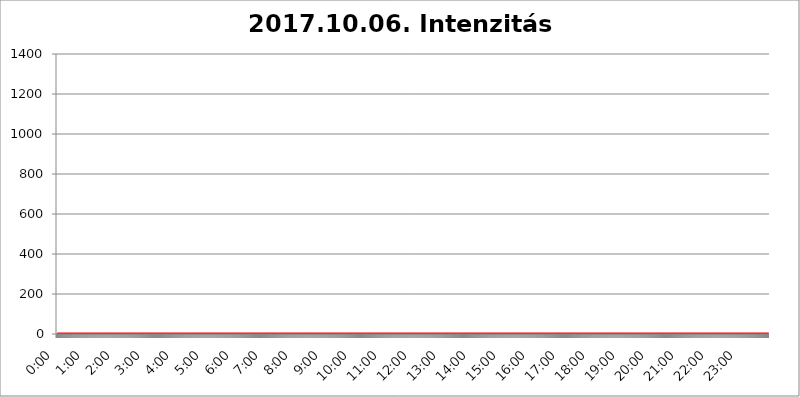
| Category | 2017.10.06. Intenzitás [W/m^2] |
|---|---|
| 0.0 | 0 |
| 0.0006944444444444445 | 0 |
| 0.001388888888888889 | 0 |
| 0.0020833333333333333 | 0 |
| 0.002777777777777778 | 0 |
| 0.003472222222222222 | 0 |
| 0.004166666666666667 | 0 |
| 0.004861111111111111 | 0 |
| 0.005555555555555556 | 0 |
| 0.0062499999999999995 | 0 |
| 0.006944444444444444 | 0 |
| 0.007638888888888889 | 0 |
| 0.008333333333333333 | 0 |
| 0.009027777777777779 | 0 |
| 0.009722222222222222 | 0 |
| 0.010416666666666666 | 0 |
| 0.011111111111111112 | 0 |
| 0.011805555555555555 | 0 |
| 0.012499999999999999 | 0 |
| 0.013194444444444444 | 0 |
| 0.013888888888888888 | 0 |
| 0.014583333333333332 | 0 |
| 0.015277777777777777 | 0 |
| 0.015972222222222224 | 0 |
| 0.016666666666666666 | 0 |
| 0.017361111111111112 | 0 |
| 0.018055555555555557 | 0 |
| 0.01875 | 0 |
| 0.019444444444444445 | 0 |
| 0.02013888888888889 | 0 |
| 0.020833333333333332 | 0 |
| 0.02152777777777778 | 0 |
| 0.022222222222222223 | 0 |
| 0.02291666666666667 | 0 |
| 0.02361111111111111 | 0 |
| 0.024305555555555556 | 0 |
| 0.024999999999999998 | 0 |
| 0.025694444444444447 | 0 |
| 0.02638888888888889 | 0 |
| 0.027083333333333334 | 0 |
| 0.027777777777777776 | 0 |
| 0.02847222222222222 | 0 |
| 0.029166666666666664 | 0 |
| 0.029861111111111113 | 0 |
| 0.030555555555555555 | 0 |
| 0.03125 | 0 |
| 0.03194444444444445 | 0 |
| 0.03263888888888889 | 0 |
| 0.03333333333333333 | 0 |
| 0.034027777777777775 | 0 |
| 0.034722222222222224 | 0 |
| 0.035416666666666666 | 0 |
| 0.036111111111111115 | 0 |
| 0.03680555555555556 | 0 |
| 0.0375 | 0 |
| 0.03819444444444444 | 0 |
| 0.03888888888888889 | 0 |
| 0.03958333333333333 | 0 |
| 0.04027777777777778 | 0 |
| 0.04097222222222222 | 0 |
| 0.041666666666666664 | 0 |
| 0.042361111111111106 | 0 |
| 0.04305555555555556 | 0 |
| 0.043750000000000004 | 0 |
| 0.044444444444444446 | 0 |
| 0.04513888888888889 | 0 |
| 0.04583333333333334 | 0 |
| 0.04652777777777778 | 0 |
| 0.04722222222222222 | 0 |
| 0.04791666666666666 | 0 |
| 0.04861111111111111 | 0 |
| 0.049305555555555554 | 0 |
| 0.049999999999999996 | 0 |
| 0.05069444444444445 | 0 |
| 0.051388888888888894 | 0 |
| 0.052083333333333336 | 0 |
| 0.05277777777777778 | 0 |
| 0.05347222222222222 | 0 |
| 0.05416666666666667 | 0 |
| 0.05486111111111111 | 0 |
| 0.05555555555555555 | 0 |
| 0.05625 | 0 |
| 0.05694444444444444 | 0 |
| 0.057638888888888885 | 0 |
| 0.05833333333333333 | 0 |
| 0.05902777777777778 | 0 |
| 0.059722222222222225 | 0 |
| 0.06041666666666667 | 0 |
| 0.061111111111111116 | 0 |
| 0.06180555555555556 | 0 |
| 0.0625 | 0 |
| 0.06319444444444444 | 0 |
| 0.06388888888888888 | 0 |
| 0.06458333333333334 | 0 |
| 0.06527777777777778 | 0 |
| 0.06597222222222222 | 0 |
| 0.06666666666666667 | 0 |
| 0.06736111111111111 | 0 |
| 0.06805555555555555 | 0 |
| 0.06874999999999999 | 0 |
| 0.06944444444444443 | 0 |
| 0.07013888888888889 | 0 |
| 0.07083333333333333 | 0 |
| 0.07152777777777779 | 0 |
| 0.07222222222222223 | 0 |
| 0.07291666666666667 | 0 |
| 0.07361111111111111 | 0 |
| 0.07430555555555556 | 0 |
| 0.075 | 0 |
| 0.07569444444444444 | 0 |
| 0.0763888888888889 | 0 |
| 0.07708333333333334 | 0 |
| 0.07777777777777778 | 0 |
| 0.07847222222222222 | 0 |
| 0.07916666666666666 | 0 |
| 0.0798611111111111 | 0 |
| 0.08055555555555556 | 0 |
| 0.08125 | 0 |
| 0.08194444444444444 | 0 |
| 0.08263888888888889 | 0 |
| 0.08333333333333333 | 0 |
| 0.08402777777777777 | 0 |
| 0.08472222222222221 | 0 |
| 0.08541666666666665 | 0 |
| 0.08611111111111112 | 0 |
| 0.08680555555555557 | 0 |
| 0.08750000000000001 | 0 |
| 0.08819444444444445 | 0 |
| 0.08888888888888889 | 0 |
| 0.08958333333333333 | 0 |
| 0.09027777777777778 | 0 |
| 0.09097222222222222 | 0 |
| 0.09166666666666667 | 0 |
| 0.09236111111111112 | 0 |
| 0.09305555555555556 | 0 |
| 0.09375 | 0 |
| 0.09444444444444444 | 0 |
| 0.09513888888888888 | 0 |
| 0.09583333333333333 | 0 |
| 0.09652777777777777 | 0 |
| 0.09722222222222222 | 0 |
| 0.09791666666666667 | 0 |
| 0.09861111111111111 | 0 |
| 0.09930555555555555 | 0 |
| 0.09999999999999999 | 0 |
| 0.10069444444444443 | 0 |
| 0.1013888888888889 | 0 |
| 0.10208333333333335 | 0 |
| 0.10277777777777779 | 0 |
| 0.10347222222222223 | 0 |
| 0.10416666666666667 | 0 |
| 0.10486111111111111 | 0 |
| 0.10555555555555556 | 0 |
| 0.10625 | 0 |
| 0.10694444444444444 | 0 |
| 0.1076388888888889 | 0 |
| 0.10833333333333334 | 0 |
| 0.10902777777777778 | 0 |
| 0.10972222222222222 | 0 |
| 0.1111111111111111 | 0 |
| 0.11180555555555556 | 0 |
| 0.11180555555555556 | 0 |
| 0.1125 | 0 |
| 0.11319444444444444 | 0 |
| 0.11388888888888889 | 0 |
| 0.11458333333333333 | 0 |
| 0.11527777777777777 | 0 |
| 0.11597222222222221 | 0 |
| 0.11666666666666665 | 0 |
| 0.1173611111111111 | 0 |
| 0.11805555555555557 | 0 |
| 0.11944444444444445 | 0 |
| 0.12013888888888889 | 0 |
| 0.12083333333333333 | 0 |
| 0.12152777777777778 | 0 |
| 0.12222222222222223 | 0 |
| 0.12291666666666667 | 0 |
| 0.12291666666666667 | 0 |
| 0.12361111111111112 | 0 |
| 0.12430555555555556 | 0 |
| 0.125 | 0 |
| 0.12569444444444444 | 0 |
| 0.12638888888888888 | 0 |
| 0.12708333333333333 | 0 |
| 0.16875 | 0 |
| 0.12847222222222224 | 0 |
| 0.12916666666666668 | 0 |
| 0.12986111111111112 | 0 |
| 0.13055555555555556 | 0 |
| 0.13125 | 0 |
| 0.13194444444444445 | 0 |
| 0.1326388888888889 | 0 |
| 0.13333333333333333 | 0 |
| 0.13402777777777777 | 0 |
| 0.13402777777777777 | 0 |
| 0.13472222222222222 | 0 |
| 0.13541666666666666 | 0 |
| 0.1361111111111111 | 0 |
| 0.13749999999999998 | 0 |
| 0.13819444444444443 | 0 |
| 0.1388888888888889 | 0 |
| 0.13958333333333334 | 0 |
| 0.14027777777777778 | 0 |
| 0.14097222222222222 | 0 |
| 0.14166666666666666 | 0 |
| 0.1423611111111111 | 0 |
| 0.14305555555555557 | 0 |
| 0.14375000000000002 | 0 |
| 0.14444444444444446 | 0 |
| 0.1451388888888889 | 0 |
| 0.1451388888888889 | 0 |
| 0.14652777777777778 | 0 |
| 0.14722222222222223 | 0 |
| 0.14791666666666667 | 0 |
| 0.1486111111111111 | 0 |
| 0.14930555555555555 | 0 |
| 0.15 | 0 |
| 0.15069444444444444 | 0 |
| 0.15138888888888888 | 0 |
| 0.15208333333333332 | 0 |
| 0.15277777777777776 | 0 |
| 0.15347222222222223 | 0 |
| 0.15416666666666667 | 0 |
| 0.15486111111111112 | 0 |
| 0.15555555555555556 | 0 |
| 0.15625 | 0 |
| 0.15694444444444444 | 0 |
| 0.15763888888888888 | 0 |
| 0.15833333333333333 | 0 |
| 0.15902777777777777 | 0 |
| 0.15972222222222224 | 0 |
| 0.16041666666666668 | 0 |
| 0.16111111111111112 | 0 |
| 0.16180555555555556 | 0 |
| 0.1625 | 0 |
| 0.16319444444444445 | 0 |
| 0.1638888888888889 | 0 |
| 0.16458333333333333 | 0 |
| 0.16527777777777777 | 0 |
| 0.16597222222222222 | 0 |
| 0.16666666666666666 | 0 |
| 0.1673611111111111 | 0 |
| 0.16805555555555554 | 0 |
| 0.16874999999999998 | 0 |
| 0.16944444444444443 | 0 |
| 0.17013888888888887 | 0 |
| 0.1708333333333333 | 0 |
| 0.17152777777777775 | 0 |
| 0.17222222222222225 | 0 |
| 0.1729166666666667 | 0 |
| 0.17361111111111113 | 0 |
| 0.17430555555555557 | 0 |
| 0.17500000000000002 | 0 |
| 0.17569444444444446 | 0 |
| 0.1763888888888889 | 0 |
| 0.17708333333333334 | 0 |
| 0.17777777777777778 | 0 |
| 0.17847222222222223 | 0 |
| 0.17916666666666667 | 0 |
| 0.1798611111111111 | 0 |
| 0.18055555555555555 | 0 |
| 0.18125 | 0 |
| 0.18194444444444444 | 0 |
| 0.1826388888888889 | 0 |
| 0.18333333333333335 | 0 |
| 0.1840277777777778 | 0 |
| 0.18472222222222223 | 0 |
| 0.18541666666666667 | 0 |
| 0.18611111111111112 | 0 |
| 0.18680555555555556 | 0 |
| 0.1875 | 0 |
| 0.18819444444444444 | 0 |
| 0.18888888888888888 | 0 |
| 0.18958333333333333 | 0 |
| 0.19027777777777777 | 0 |
| 0.1909722222222222 | 0 |
| 0.19166666666666665 | 0 |
| 0.19236111111111112 | 0 |
| 0.19305555555555554 | 0 |
| 0.19375 | 0 |
| 0.19444444444444445 | 0 |
| 0.1951388888888889 | 0 |
| 0.19583333333333333 | 0 |
| 0.19652777777777777 | 0 |
| 0.19722222222222222 | 0 |
| 0.19791666666666666 | 0 |
| 0.1986111111111111 | 0 |
| 0.19930555555555554 | 0 |
| 0.19999999999999998 | 0 |
| 0.20069444444444443 | 0 |
| 0.20138888888888887 | 0 |
| 0.2020833333333333 | 0 |
| 0.2027777777777778 | 0 |
| 0.2034722222222222 | 0 |
| 0.2041666666666667 | 0 |
| 0.20486111111111113 | 0 |
| 0.20555555555555557 | 0 |
| 0.20625000000000002 | 0 |
| 0.20694444444444446 | 0 |
| 0.2076388888888889 | 0 |
| 0.20833333333333334 | 0 |
| 0.20902777777777778 | 0 |
| 0.20972222222222223 | 0 |
| 0.21041666666666667 | 0 |
| 0.2111111111111111 | 0 |
| 0.21180555555555555 | 0 |
| 0.2125 | 0 |
| 0.21319444444444444 | 0 |
| 0.2138888888888889 | 0 |
| 0.21458333333333335 | 0 |
| 0.2152777777777778 | 0 |
| 0.21597222222222223 | 0 |
| 0.21666666666666667 | 0 |
| 0.21736111111111112 | 0 |
| 0.21805555555555556 | 0 |
| 0.21875 | 0 |
| 0.21944444444444444 | 0 |
| 0.22013888888888888 | 0 |
| 0.22083333333333333 | 0 |
| 0.22152777777777777 | 0 |
| 0.2222222222222222 | 0 |
| 0.22291666666666665 | 0 |
| 0.2236111111111111 | 0 |
| 0.22430555555555556 | 0 |
| 0.225 | 0 |
| 0.22569444444444445 | 0 |
| 0.2263888888888889 | 0 |
| 0.22708333333333333 | 0 |
| 0.22777777777777777 | 0 |
| 0.22847222222222222 | 0 |
| 0.22916666666666666 | 0 |
| 0.2298611111111111 | 0 |
| 0.23055555555555554 | 0 |
| 0.23124999999999998 | 0 |
| 0.23194444444444443 | 0 |
| 0.23263888888888887 | 0 |
| 0.2333333333333333 | 0 |
| 0.2340277777777778 | 0 |
| 0.2347222222222222 | 0 |
| 0.2354166666666667 | 0 |
| 0.23611111111111113 | 0 |
| 0.23680555555555557 | 0 |
| 0.23750000000000002 | 0 |
| 0.23819444444444446 | 0 |
| 0.2388888888888889 | 0 |
| 0.23958333333333334 | 0 |
| 0.24027777777777778 | 0 |
| 0.24097222222222223 | 0 |
| 0.24166666666666667 | 0 |
| 0.2423611111111111 | 0 |
| 0.24305555555555555 | 0 |
| 0.24375 | 0 |
| 0.24444444444444446 | 0 |
| 0.24513888888888888 | 0 |
| 0.24583333333333335 | 0 |
| 0.2465277777777778 | 0 |
| 0.24722222222222223 | 0 |
| 0.24791666666666667 | 0 |
| 0.24861111111111112 | 0 |
| 0.24930555555555556 | 0 |
| 0.25 | 0 |
| 0.25069444444444444 | 0 |
| 0.2513888888888889 | 0 |
| 0.2520833333333333 | 0 |
| 0.25277777777777777 | 0 |
| 0.2534722222222222 | 0 |
| 0.25416666666666665 | 0 |
| 0.2548611111111111 | 0 |
| 0.2555555555555556 | 0 |
| 0.25625000000000003 | 0 |
| 0.2569444444444445 | 0 |
| 0.2576388888888889 | 0 |
| 0.25833333333333336 | 0 |
| 0.2590277777777778 | 0 |
| 0.25972222222222224 | 0 |
| 0.2604166666666667 | 0 |
| 0.2611111111111111 | 0 |
| 0.26180555555555557 | 0 |
| 0.2625 | 0 |
| 0.26319444444444445 | 0 |
| 0.2638888888888889 | 0 |
| 0.26458333333333334 | 0 |
| 0.2652777777777778 | 0 |
| 0.2659722222222222 | 0 |
| 0.26666666666666666 | 0 |
| 0.2673611111111111 | 0 |
| 0.26805555555555555 | 0 |
| 0.26875 | 0 |
| 0.26944444444444443 | 0 |
| 0.2701388888888889 | 0 |
| 0.2708333333333333 | 0 |
| 0.27152777777777776 | 0 |
| 0.2722222222222222 | 0 |
| 0.27291666666666664 | 0 |
| 0.2736111111111111 | 0 |
| 0.2743055555555555 | 0 |
| 0.27499999999999997 | 0 |
| 0.27569444444444446 | 0 |
| 0.27638888888888885 | 0 |
| 0.27708333333333335 | 0 |
| 0.2777777777777778 | 0 |
| 0.27847222222222223 | 0 |
| 0.2791666666666667 | 0 |
| 0.2798611111111111 | 0 |
| 0.28055555555555556 | 0 |
| 0.28125 | 0 |
| 0.28194444444444444 | 0 |
| 0.2826388888888889 | 0 |
| 0.2833333333333333 | 0 |
| 0.28402777777777777 | 0 |
| 0.2847222222222222 | 0 |
| 0.28541666666666665 | 0 |
| 0.28611111111111115 | 0 |
| 0.28680555555555554 | 0 |
| 0.28750000000000003 | 0 |
| 0.2881944444444445 | 0 |
| 0.2888888888888889 | 0 |
| 0.28958333333333336 | 0 |
| 0.2902777777777778 | 0 |
| 0.29097222222222224 | 0 |
| 0.2916666666666667 | 0 |
| 0.2923611111111111 | 0 |
| 0.29305555555555557 | 0 |
| 0.29375 | 0 |
| 0.29444444444444445 | 0 |
| 0.2951388888888889 | 0 |
| 0.29583333333333334 | 0 |
| 0.2965277777777778 | 0 |
| 0.2972222222222222 | 0 |
| 0.29791666666666666 | 0 |
| 0.2986111111111111 | 0 |
| 0.29930555555555555 | 0 |
| 0.3 | 0 |
| 0.30069444444444443 | 0 |
| 0.3013888888888889 | 0 |
| 0.3020833333333333 | 0 |
| 0.30277777777777776 | 0 |
| 0.3034722222222222 | 0 |
| 0.30416666666666664 | 0 |
| 0.3048611111111111 | 0 |
| 0.3055555555555555 | 0 |
| 0.30624999999999997 | 0 |
| 0.3069444444444444 | 0 |
| 0.3076388888888889 | 0 |
| 0.30833333333333335 | 0 |
| 0.3090277777777778 | 0 |
| 0.30972222222222223 | 0 |
| 0.3104166666666667 | 0 |
| 0.3111111111111111 | 0 |
| 0.31180555555555556 | 0 |
| 0.3125 | 0 |
| 0.31319444444444444 | 0 |
| 0.3138888888888889 | 0 |
| 0.3145833333333333 | 0 |
| 0.31527777777777777 | 0 |
| 0.3159722222222222 | 0 |
| 0.31666666666666665 | 0 |
| 0.31736111111111115 | 0 |
| 0.31805555555555554 | 0 |
| 0.31875000000000003 | 0 |
| 0.3194444444444445 | 0 |
| 0.3201388888888889 | 0 |
| 0.32083333333333336 | 0 |
| 0.3215277777777778 | 0 |
| 0.32222222222222224 | 0 |
| 0.3229166666666667 | 0 |
| 0.3236111111111111 | 0 |
| 0.32430555555555557 | 0 |
| 0.325 | 0 |
| 0.32569444444444445 | 0 |
| 0.3263888888888889 | 0 |
| 0.32708333333333334 | 0 |
| 0.3277777777777778 | 0 |
| 0.3284722222222222 | 0 |
| 0.32916666666666666 | 0 |
| 0.3298611111111111 | 0 |
| 0.33055555555555555 | 0 |
| 0.33125 | 0 |
| 0.33194444444444443 | 0 |
| 0.3326388888888889 | 0 |
| 0.3333333333333333 | 0 |
| 0.3340277777777778 | 0 |
| 0.3347222222222222 | 0 |
| 0.3354166666666667 | 0 |
| 0.3361111111111111 | 0 |
| 0.3368055555555556 | 0 |
| 0.33749999999999997 | 0 |
| 0.33819444444444446 | 0 |
| 0.33888888888888885 | 0 |
| 0.33958333333333335 | 0 |
| 0.34027777777777773 | 0 |
| 0.34097222222222223 | 0 |
| 0.3416666666666666 | 0 |
| 0.3423611111111111 | 0 |
| 0.3430555555555555 | 0 |
| 0.34375 | 0 |
| 0.3444444444444445 | 0 |
| 0.3451388888888889 | 0 |
| 0.3458333333333334 | 0 |
| 0.34652777777777777 | 0 |
| 0.34722222222222227 | 0 |
| 0.34791666666666665 | 0 |
| 0.34861111111111115 | 0 |
| 0.34930555555555554 | 0 |
| 0.35000000000000003 | 0 |
| 0.3506944444444444 | 0 |
| 0.3513888888888889 | 0 |
| 0.3520833333333333 | 0 |
| 0.3527777777777778 | 0 |
| 0.3534722222222222 | 0 |
| 0.3541666666666667 | 0 |
| 0.3548611111111111 | 0 |
| 0.35555555555555557 | 0 |
| 0.35625 | 0 |
| 0.35694444444444445 | 0 |
| 0.3576388888888889 | 0 |
| 0.35833333333333334 | 0 |
| 0.3590277777777778 | 0 |
| 0.3597222222222222 | 0 |
| 0.36041666666666666 | 0 |
| 0.3611111111111111 | 0 |
| 0.36180555555555555 | 0 |
| 0.3625 | 0 |
| 0.36319444444444443 | 0 |
| 0.3638888888888889 | 0 |
| 0.3645833333333333 | 0 |
| 0.3652777777777778 | 0 |
| 0.3659722222222222 | 0 |
| 0.3666666666666667 | 0 |
| 0.3673611111111111 | 0 |
| 0.3680555555555556 | 0 |
| 0.36874999999999997 | 0 |
| 0.36944444444444446 | 0 |
| 0.37013888888888885 | 0 |
| 0.37083333333333335 | 0 |
| 0.37152777777777773 | 0 |
| 0.37222222222222223 | 0 |
| 0.3729166666666666 | 0 |
| 0.3736111111111111 | 0 |
| 0.3743055555555555 | 0 |
| 0.375 | 0 |
| 0.3756944444444445 | 0 |
| 0.3763888888888889 | 0 |
| 0.3770833333333334 | 0 |
| 0.37777777777777777 | 0 |
| 0.37847222222222227 | 0 |
| 0.37916666666666665 | 0 |
| 0.37986111111111115 | 0 |
| 0.38055555555555554 | 0 |
| 0.38125000000000003 | 0 |
| 0.3819444444444444 | 0 |
| 0.3826388888888889 | 0 |
| 0.3833333333333333 | 0 |
| 0.3840277777777778 | 0 |
| 0.3847222222222222 | 0 |
| 0.3854166666666667 | 0 |
| 0.3861111111111111 | 0 |
| 0.38680555555555557 | 0 |
| 0.3875 | 0 |
| 0.38819444444444445 | 0 |
| 0.3888888888888889 | 0 |
| 0.38958333333333334 | 0 |
| 0.3902777777777778 | 0 |
| 0.3909722222222222 | 0 |
| 0.39166666666666666 | 0 |
| 0.3923611111111111 | 0 |
| 0.39305555555555555 | 0 |
| 0.39375 | 0 |
| 0.39444444444444443 | 0 |
| 0.3951388888888889 | 0 |
| 0.3958333333333333 | 0 |
| 0.3965277777777778 | 0 |
| 0.3972222222222222 | 0 |
| 0.3979166666666667 | 0 |
| 0.3986111111111111 | 0 |
| 0.3993055555555556 | 0 |
| 0.39999999999999997 | 0 |
| 0.40069444444444446 | 0 |
| 0.40138888888888885 | 0 |
| 0.40208333333333335 | 0 |
| 0.40277777777777773 | 0 |
| 0.40347222222222223 | 0 |
| 0.4041666666666666 | 0 |
| 0.4048611111111111 | 0 |
| 0.4055555555555555 | 0 |
| 0.40625 | 0 |
| 0.4069444444444445 | 0 |
| 0.4076388888888889 | 0 |
| 0.4083333333333334 | 0 |
| 0.40902777777777777 | 0 |
| 0.40972222222222227 | 0 |
| 0.41041666666666665 | 0 |
| 0.41111111111111115 | 0 |
| 0.41180555555555554 | 0 |
| 0.41250000000000003 | 0 |
| 0.4131944444444444 | 0 |
| 0.4138888888888889 | 0 |
| 0.4145833333333333 | 0 |
| 0.4152777777777778 | 0 |
| 0.4159722222222222 | 0 |
| 0.4166666666666667 | 0 |
| 0.4173611111111111 | 0 |
| 0.41805555555555557 | 0 |
| 0.41875 | 0 |
| 0.41944444444444445 | 0 |
| 0.4201388888888889 | 0 |
| 0.42083333333333334 | 0 |
| 0.4215277777777778 | 0 |
| 0.4222222222222222 | 0 |
| 0.42291666666666666 | 0 |
| 0.4236111111111111 | 0 |
| 0.42430555555555555 | 0 |
| 0.425 | 0 |
| 0.42569444444444443 | 0 |
| 0.4263888888888889 | 0 |
| 0.4270833333333333 | 0 |
| 0.4277777777777778 | 0 |
| 0.4284722222222222 | 0 |
| 0.4291666666666667 | 0 |
| 0.4298611111111111 | 0 |
| 0.4305555555555556 | 0 |
| 0.43124999999999997 | 0 |
| 0.43194444444444446 | 0 |
| 0.43263888888888885 | 0 |
| 0.43333333333333335 | 0 |
| 0.43402777777777773 | 0 |
| 0.43472222222222223 | 0 |
| 0.4354166666666666 | 0 |
| 0.4361111111111111 | 0 |
| 0.4368055555555555 | 0 |
| 0.4375 | 0 |
| 0.4381944444444445 | 0 |
| 0.4388888888888889 | 0 |
| 0.4395833333333334 | 0 |
| 0.44027777777777777 | 0 |
| 0.44097222222222227 | 0 |
| 0.44166666666666665 | 0 |
| 0.44236111111111115 | 0 |
| 0.44305555555555554 | 0 |
| 0.44375000000000003 | 0 |
| 0.4444444444444444 | 0 |
| 0.4451388888888889 | 0 |
| 0.4458333333333333 | 0 |
| 0.4465277777777778 | 0 |
| 0.4472222222222222 | 0 |
| 0.4479166666666667 | 0 |
| 0.4486111111111111 | 0 |
| 0.44930555555555557 | 0 |
| 0.45 | 0 |
| 0.45069444444444445 | 0 |
| 0.4513888888888889 | 0 |
| 0.45208333333333334 | 0 |
| 0.4527777777777778 | 0 |
| 0.4534722222222222 | 0 |
| 0.45416666666666666 | 0 |
| 0.4548611111111111 | 0 |
| 0.45555555555555555 | 0 |
| 0.45625 | 0 |
| 0.45694444444444443 | 0 |
| 0.4576388888888889 | 0 |
| 0.4583333333333333 | 0 |
| 0.4590277777777778 | 0 |
| 0.4597222222222222 | 0 |
| 0.4604166666666667 | 0 |
| 0.4611111111111111 | 0 |
| 0.4618055555555556 | 0 |
| 0.46249999999999997 | 0 |
| 0.46319444444444446 | 0 |
| 0.46388888888888885 | 0 |
| 0.46458333333333335 | 0 |
| 0.46527777777777773 | 0 |
| 0.46597222222222223 | 0 |
| 0.4666666666666666 | 0 |
| 0.4673611111111111 | 0 |
| 0.4680555555555555 | 0 |
| 0.46875 | 0 |
| 0.4694444444444445 | 0 |
| 0.4701388888888889 | 0 |
| 0.4708333333333334 | 0 |
| 0.47152777777777777 | 0 |
| 0.47222222222222227 | 0 |
| 0.47291666666666665 | 0 |
| 0.47361111111111115 | 0 |
| 0.47430555555555554 | 0 |
| 0.47500000000000003 | 0 |
| 0.4756944444444444 | 0 |
| 0.4763888888888889 | 0 |
| 0.4770833333333333 | 0 |
| 0.4777777777777778 | 0 |
| 0.4784722222222222 | 0 |
| 0.4791666666666667 | 0 |
| 0.4798611111111111 | 0 |
| 0.48055555555555557 | 0 |
| 0.48125 | 0 |
| 0.48194444444444445 | 0 |
| 0.4826388888888889 | 0 |
| 0.48333333333333334 | 0 |
| 0.4840277777777778 | 0 |
| 0.4847222222222222 | 0 |
| 0.48541666666666666 | 0 |
| 0.4861111111111111 | 0 |
| 0.48680555555555555 | 0 |
| 0.4875 | 0 |
| 0.48819444444444443 | 0 |
| 0.4888888888888889 | 0 |
| 0.4895833333333333 | 0 |
| 0.4902777777777778 | 0 |
| 0.4909722222222222 | 0 |
| 0.4916666666666667 | 0 |
| 0.4923611111111111 | 0 |
| 0.4930555555555556 | 0 |
| 0.49374999999999997 | 0 |
| 0.49444444444444446 | 0 |
| 0.49513888888888885 | 0 |
| 0.49583333333333335 | 0 |
| 0.49652777777777773 | 0 |
| 0.49722222222222223 | 0 |
| 0.4979166666666666 | 0 |
| 0.4986111111111111 | 0 |
| 0.4993055555555555 | 0 |
| 0.5 | 0 |
| 0.5006944444444444 | 0 |
| 0.5013888888888889 | 0 |
| 0.5020833333333333 | 0 |
| 0.5027777777777778 | 0 |
| 0.5034722222222222 | 0 |
| 0.5041666666666667 | 0 |
| 0.5048611111111111 | 0 |
| 0.5055555555555555 | 0 |
| 0.50625 | 0 |
| 0.5069444444444444 | 0 |
| 0.5076388888888889 | 0 |
| 0.5083333333333333 | 0 |
| 0.5090277777777777 | 0 |
| 0.5097222222222222 | 0 |
| 0.5104166666666666 | 0 |
| 0.5111111111111112 | 0 |
| 0.5118055555555555 | 0 |
| 0.5125000000000001 | 0 |
| 0.5131944444444444 | 0 |
| 0.513888888888889 | 0 |
| 0.5145833333333333 | 0 |
| 0.5152777777777778 | 0 |
| 0.5159722222222222 | 0 |
| 0.5166666666666667 | 0 |
| 0.517361111111111 | 0 |
| 0.5180555555555556 | 0 |
| 0.5187499999999999 | 0 |
| 0.5194444444444445 | 0 |
| 0.5201388888888888 | 0 |
| 0.5208333333333334 | 0 |
| 0.5215277777777778 | 0 |
| 0.5222222222222223 | 0 |
| 0.5229166666666667 | 0 |
| 0.5236111111111111 | 0 |
| 0.5243055555555556 | 0 |
| 0.525 | 0 |
| 0.5256944444444445 | 0 |
| 0.5263888888888889 | 0 |
| 0.5270833333333333 | 0 |
| 0.5277777777777778 | 0 |
| 0.5284722222222222 | 0 |
| 0.5291666666666667 | 0 |
| 0.5298611111111111 | 0 |
| 0.5305555555555556 | 0 |
| 0.53125 | 0 |
| 0.5319444444444444 | 0 |
| 0.5326388888888889 | 0 |
| 0.5333333333333333 | 0 |
| 0.5340277777777778 | 0 |
| 0.5347222222222222 | 0 |
| 0.5354166666666667 | 0 |
| 0.5361111111111111 | 0 |
| 0.5368055555555555 | 0 |
| 0.5375 | 0 |
| 0.5381944444444444 | 0 |
| 0.5388888888888889 | 0 |
| 0.5395833333333333 | 0 |
| 0.5402777777777777 | 0 |
| 0.5409722222222222 | 0 |
| 0.5416666666666666 | 0 |
| 0.5423611111111112 | 0 |
| 0.5430555555555555 | 0 |
| 0.5437500000000001 | 0 |
| 0.5444444444444444 | 0 |
| 0.545138888888889 | 0 |
| 0.5458333333333333 | 0 |
| 0.5465277777777778 | 0 |
| 0.5472222222222222 | 0 |
| 0.5479166666666667 | 0 |
| 0.548611111111111 | 0 |
| 0.5493055555555556 | 0 |
| 0.5499999999999999 | 0 |
| 0.5506944444444445 | 0 |
| 0.5513888888888888 | 0 |
| 0.5520833333333334 | 0 |
| 0.5527777777777778 | 0 |
| 0.5534722222222223 | 0 |
| 0.5541666666666667 | 0 |
| 0.5548611111111111 | 0 |
| 0.5555555555555556 | 0 |
| 0.55625 | 0 |
| 0.5569444444444445 | 0 |
| 0.5576388888888889 | 0 |
| 0.5583333333333333 | 0 |
| 0.5590277777777778 | 0 |
| 0.5597222222222222 | 0 |
| 0.5604166666666667 | 0 |
| 0.5611111111111111 | 0 |
| 0.5618055555555556 | 0 |
| 0.5625 | 0 |
| 0.5631944444444444 | 0 |
| 0.5638888888888889 | 0 |
| 0.5645833333333333 | 0 |
| 0.5652777777777778 | 0 |
| 0.5659722222222222 | 0 |
| 0.5666666666666667 | 0 |
| 0.5673611111111111 | 0 |
| 0.5680555555555555 | 0 |
| 0.56875 | 0 |
| 0.5694444444444444 | 0 |
| 0.5701388888888889 | 0 |
| 0.5708333333333333 | 0 |
| 0.5715277777777777 | 0 |
| 0.5722222222222222 | 0 |
| 0.5729166666666666 | 0 |
| 0.5736111111111112 | 0 |
| 0.5743055555555555 | 0 |
| 0.5750000000000001 | 0 |
| 0.5756944444444444 | 0 |
| 0.576388888888889 | 0 |
| 0.5770833333333333 | 0 |
| 0.5777777777777778 | 0 |
| 0.5784722222222222 | 0 |
| 0.5791666666666667 | 0 |
| 0.579861111111111 | 0 |
| 0.5805555555555556 | 0 |
| 0.5812499999999999 | 0 |
| 0.5819444444444445 | 0 |
| 0.5826388888888888 | 0 |
| 0.5833333333333334 | 0 |
| 0.5840277777777778 | 0 |
| 0.5847222222222223 | 0 |
| 0.5854166666666667 | 0 |
| 0.5861111111111111 | 0 |
| 0.5868055555555556 | 0 |
| 0.5875 | 0 |
| 0.5881944444444445 | 0 |
| 0.5888888888888889 | 0 |
| 0.5895833333333333 | 0 |
| 0.5902777777777778 | 0 |
| 0.5909722222222222 | 0 |
| 0.5916666666666667 | 0 |
| 0.5923611111111111 | 0 |
| 0.5930555555555556 | 0 |
| 0.59375 | 0 |
| 0.5944444444444444 | 0 |
| 0.5951388888888889 | 0 |
| 0.5958333333333333 | 0 |
| 0.5965277777777778 | 0 |
| 0.5972222222222222 | 0 |
| 0.5979166666666667 | 0 |
| 0.5986111111111111 | 0 |
| 0.5993055555555555 | 0 |
| 0.6 | 0 |
| 0.6006944444444444 | 0 |
| 0.6013888888888889 | 0 |
| 0.6020833333333333 | 0 |
| 0.6027777777777777 | 0 |
| 0.6034722222222222 | 0 |
| 0.6041666666666666 | 0 |
| 0.6048611111111112 | 0 |
| 0.6055555555555555 | 0 |
| 0.6062500000000001 | 0 |
| 0.6069444444444444 | 0 |
| 0.607638888888889 | 0 |
| 0.6083333333333333 | 0 |
| 0.6090277777777778 | 0 |
| 0.6097222222222222 | 0 |
| 0.6104166666666667 | 0 |
| 0.611111111111111 | 0 |
| 0.6118055555555556 | 0 |
| 0.6124999999999999 | 0 |
| 0.6131944444444445 | 0 |
| 0.6138888888888888 | 0 |
| 0.6145833333333334 | 0 |
| 0.6152777777777778 | 0 |
| 0.6159722222222223 | 0 |
| 0.6166666666666667 | 0 |
| 0.6173611111111111 | 0 |
| 0.6180555555555556 | 0 |
| 0.61875 | 0 |
| 0.6194444444444445 | 0 |
| 0.6201388888888889 | 0 |
| 0.6208333333333333 | 0 |
| 0.6215277777777778 | 0 |
| 0.6222222222222222 | 0 |
| 0.6229166666666667 | 0 |
| 0.6236111111111111 | 0 |
| 0.6243055555555556 | 0 |
| 0.625 | 0 |
| 0.6256944444444444 | 0 |
| 0.6263888888888889 | 0 |
| 0.6270833333333333 | 0 |
| 0.6277777777777778 | 0 |
| 0.6284722222222222 | 0 |
| 0.6291666666666667 | 0 |
| 0.6298611111111111 | 0 |
| 0.6305555555555555 | 0 |
| 0.63125 | 0 |
| 0.6319444444444444 | 0 |
| 0.6326388888888889 | 0 |
| 0.6333333333333333 | 0 |
| 0.6340277777777777 | 0 |
| 0.6347222222222222 | 0 |
| 0.6354166666666666 | 0 |
| 0.6361111111111112 | 0 |
| 0.6368055555555555 | 0 |
| 0.6375000000000001 | 0 |
| 0.6381944444444444 | 0 |
| 0.638888888888889 | 0 |
| 0.6395833333333333 | 0 |
| 0.6402777777777778 | 0 |
| 0.6409722222222222 | 0 |
| 0.6416666666666667 | 0 |
| 0.642361111111111 | 0 |
| 0.6430555555555556 | 0 |
| 0.6437499999999999 | 0 |
| 0.6444444444444445 | 0 |
| 0.6451388888888888 | 0 |
| 0.6458333333333334 | 0 |
| 0.6465277777777778 | 0 |
| 0.6472222222222223 | 0 |
| 0.6479166666666667 | 0 |
| 0.6486111111111111 | 0 |
| 0.6493055555555556 | 0 |
| 0.65 | 0 |
| 0.6506944444444445 | 0 |
| 0.6513888888888889 | 0 |
| 0.6520833333333333 | 0 |
| 0.6527777777777778 | 0 |
| 0.6534722222222222 | 0 |
| 0.6541666666666667 | 0 |
| 0.6548611111111111 | 0 |
| 0.6555555555555556 | 0 |
| 0.65625 | 0 |
| 0.6569444444444444 | 0 |
| 0.6576388888888889 | 0 |
| 0.6583333333333333 | 0 |
| 0.6590277777777778 | 0 |
| 0.6597222222222222 | 0 |
| 0.6604166666666667 | 0 |
| 0.6611111111111111 | 0 |
| 0.6618055555555555 | 0 |
| 0.6625 | 0 |
| 0.6631944444444444 | 0 |
| 0.6638888888888889 | 0 |
| 0.6645833333333333 | 0 |
| 0.6652777777777777 | 0 |
| 0.6659722222222222 | 0 |
| 0.6666666666666666 | 0 |
| 0.6673611111111111 | 0 |
| 0.6680555555555556 | 0 |
| 0.6687500000000001 | 0 |
| 0.6694444444444444 | 0 |
| 0.6701388888888888 | 0 |
| 0.6708333333333334 | 0 |
| 0.6715277777777778 | 0 |
| 0.6722222222222222 | 0 |
| 0.6729166666666666 | 0 |
| 0.6736111111111112 | 0 |
| 0.6743055555555556 | 0 |
| 0.6749999999999999 | 0 |
| 0.6756944444444444 | 0 |
| 0.6763888888888889 | 0 |
| 0.6770833333333334 | 0 |
| 0.6777777777777777 | 0 |
| 0.6784722222222223 | 0 |
| 0.6791666666666667 | 0 |
| 0.6798611111111111 | 0 |
| 0.6805555555555555 | 0 |
| 0.68125 | 0 |
| 0.6819444444444445 | 0 |
| 0.6826388888888889 | 0 |
| 0.6833333333333332 | 0 |
| 0.6840277777777778 | 0 |
| 0.6847222222222222 | 0 |
| 0.6854166666666667 | 0 |
| 0.686111111111111 | 0 |
| 0.6868055555555556 | 0 |
| 0.6875 | 0 |
| 0.6881944444444444 | 0 |
| 0.688888888888889 | 0 |
| 0.6895833333333333 | 0 |
| 0.6902777777777778 | 0 |
| 0.6909722222222222 | 0 |
| 0.6916666666666668 | 0 |
| 0.6923611111111111 | 0 |
| 0.6930555555555555 | 0 |
| 0.69375 | 0 |
| 0.6944444444444445 | 0 |
| 0.6951388888888889 | 0 |
| 0.6958333333333333 | 0 |
| 0.6965277777777777 | 0 |
| 0.6972222222222223 | 0 |
| 0.6979166666666666 | 0 |
| 0.6986111111111111 | 0 |
| 0.6993055555555556 | 0 |
| 0.7000000000000001 | 0 |
| 0.7006944444444444 | 0 |
| 0.7013888888888888 | 0 |
| 0.7020833333333334 | 0 |
| 0.7027777777777778 | 0 |
| 0.7034722222222222 | 0 |
| 0.7041666666666666 | 0 |
| 0.7048611111111112 | 0 |
| 0.7055555555555556 | 0 |
| 0.7062499999999999 | 0 |
| 0.7069444444444444 | 0 |
| 0.7076388888888889 | 0 |
| 0.7083333333333334 | 0 |
| 0.7090277777777777 | 0 |
| 0.7097222222222223 | 0 |
| 0.7104166666666667 | 0 |
| 0.7111111111111111 | 0 |
| 0.7118055555555555 | 0 |
| 0.7125 | 0 |
| 0.7131944444444445 | 0 |
| 0.7138888888888889 | 0 |
| 0.7145833333333332 | 0 |
| 0.7152777777777778 | 0 |
| 0.7159722222222222 | 0 |
| 0.7166666666666667 | 0 |
| 0.717361111111111 | 0 |
| 0.7180555555555556 | 0 |
| 0.71875 | 0 |
| 0.7194444444444444 | 0 |
| 0.720138888888889 | 0 |
| 0.7208333333333333 | 0 |
| 0.7215277777777778 | 0 |
| 0.7222222222222222 | 0 |
| 0.7229166666666668 | 0 |
| 0.7236111111111111 | 0 |
| 0.7243055555555555 | 0 |
| 0.725 | 0 |
| 0.7256944444444445 | 0 |
| 0.7263888888888889 | 0 |
| 0.7270833333333333 | 0 |
| 0.7277777777777777 | 0 |
| 0.7284722222222223 | 0 |
| 0.7291666666666666 | 0 |
| 0.7298611111111111 | 0 |
| 0.7305555555555556 | 0 |
| 0.7312500000000001 | 0 |
| 0.7319444444444444 | 0 |
| 0.7326388888888888 | 0 |
| 0.7333333333333334 | 0 |
| 0.7340277777777778 | 0 |
| 0.7347222222222222 | 0 |
| 0.7354166666666666 | 0 |
| 0.7361111111111112 | 0 |
| 0.7368055555555556 | 0 |
| 0.7374999999999999 | 0 |
| 0.7381944444444444 | 0 |
| 0.7388888888888889 | 0 |
| 0.7395833333333334 | 0 |
| 0.7402777777777777 | 0 |
| 0.7409722222222223 | 0 |
| 0.7416666666666667 | 0 |
| 0.7423611111111111 | 0 |
| 0.7430555555555555 | 0 |
| 0.74375 | 0 |
| 0.7444444444444445 | 0 |
| 0.7451388888888889 | 0 |
| 0.7458333333333332 | 0 |
| 0.7465277777777778 | 0 |
| 0.7472222222222222 | 0 |
| 0.7479166666666667 | 0 |
| 0.748611111111111 | 0 |
| 0.7493055555555556 | 0 |
| 0.75 | 0 |
| 0.7506944444444444 | 0 |
| 0.751388888888889 | 0 |
| 0.7520833333333333 | 0 |
| 0.7527777777777778 | 0 |
| 0.7534722222222222 | 0 |
| 0.7541666666666668 | 0 |
| 0.7548611111111111 | 0 |
| 0.7555555555555555 | 0 |
| 0.75625 | 0 |
| 0.7569444444444445 | 0 |
| 0.7576388888888889 | 0 |
| 0.7583333333333333 | 0 |
| 0.7590277777777777 | 0 |
| 0.7597222222222223 | 0 |
| 0.7604166666666666 | 0 |
| 0.7611111111111111 | 0 |
| 0.7618055555555556 | 0 |
| 0.7625000000000001 | 0 |
| 0.7631944444444444 | 0 |
| 0.7638888888888888 | 0 |
| 0.7645833333333334 | 0 |
| 0.7652777777777778 | 0 |
| 0.7659722222222222 | 0 |
| 0.7666666666666666 | 0 |
| 0.7673611111111112 | 0 |
| 0.7680555555555556 | 0 |
| 0.7687499999999999 | 0 |
| 0.7694444444444444 | 0 |
| 0.7701388888888889 | 0 |
| 0.7708333333333334 | 0 |
| 0.7715277777777777 | 0 |
| 0.7722222222222223 | 0 |
| 0.7729166666666667 | 0 |
| 0.7736111111111111 | 0 |
| 0.7743055555555555 | 0 |
| 0.775 | 0 |
| 0.7756944444444445 | 0 |
| 0.7763888888888889 | 0 |
| 0.7770833333333332 | 0 |
| 0.7777777777777778 | 0 |
| 0.7784722222222222 | 0 |
| 0.7791666666666667 | 0 |
| 0.779861111111111 | 0 |
| 0.7805555555555556 | 0 |
| 0.78125 | 0 |
| 0.7819444444444444 | 0 |
| 0.782638888888889 | 0 |
| 0.7833333333333333 | 0 |
| 0.7840277777777778 | 0 |
| 0.7847222222222222 | 0 |
| 0.7854166666666668 | 0 |
| 0.7861111111111111 | 0 |
| 0.7868055555555555 | 0 |
| 0.7875 | 0 |
| 0.7881944444444445 | 0 |
| 0.7888888888888889 | 0 |
| 0.7895833333333333 | 0 |
| 0.7902777777777777 | 0 |
| 0.7909722222222223 | 0 |
| 0.7916666666666666 | 0 |
| 0.7923611111111111 | 0 |
| 0.7930555555555556 | 0 |
| 0.7937500000000001 | 0 |
| 0.7944444444444444 | 0 |
| 0.7951388888888888 | 0 |
| 0.7958333333333334 | 0 |
| 0.7965277777777778 | 0 |
| 0.7972222222222222 | 0 |
| 0.7979166666666666 | 0 |
| 0.7986111111111112 | 0 |
| 0.7993055555555556 | 0 |
| 0.7999999999999999 | 0 |
| 0.8006944444444444 | 0 |
| 0.8013888888888889 | 0 |
| 0.8020833333333334 | 0 |
| 0.8027777777777777 | 0 |
| 0.8034722222222223 | 0 |
| 0.8041666666666667 | 0 |
| 0.8048611111111111 | 0 |
| 0.8055555555555555 | 0 |
| 0.80625 | 0 |
| 0.8069444444444445 | 0 |
| 0.8076388888888889 | 0 |
| 0.8083333333333332 | 0 |
| 0.8090277777777778 | 0 |
| 0.8097222222222222 | 0 |
| 0.8104166666666667 | 0 |
| 0.811111111111111 | 0 |
| 0.8118055555555556 | 0 |
| 0.8125 | 0 |
| 0.8131944444444444 | 0 |
| 0.813888888888889 | 0 |
| 0.8145833333333333 | 0 |
| 0.8152777777777778 | 0 |
| 0.8159722222222222 | 0 |
| 0.8166666666666668 | 0 |
| 0.8173611111111111 | 0 |
| 0.8180555555555555 | 0 |
| 0.81875 | 0 |
| 0.8194444444444445 | 0 |
| 0.8201388888888889 | 0 |
| 0.8208333333333333 | 0 |
| 0.8215277777777777 | 0 |
| 0.8222222222222223 | 0 |
| 0.8229166666666666 | 0 |
| 0.8236111111111111 | 0 |
| 0.8243055555555556 | 0 |
| 0.8250000000000001 | 0 |
| 0.8256944444444444 | 0 |
| 0.8263888888888888 | 0 |
| 0.8270833333333334 | 0 |
| 0.8277777777777778 | 0 |
| 0.8284722222222222 | 0 |
| 0.8291666666666666 | 0 |
| 0.8298611111111112 | 0 |
| 0.8305555555555556 | 0 |
| 0.8312499999999999 | 0 |
| 0.8319444444444444 | 0 |
| 0.8326388888888889 | 0 |
| 0.8333333333333334 | 0 |
| 0.8340277777777777 | 0 |
| 0.8347222222222223 | 0 |
| 0.8354166666666667 | 0 |
| 0.8361111111111111 | 0 |
| 0.8368055555555555 | 0 |
| 0.8375 | 0 |
| 0.8381944444444445 | 0 |
| 0.8388888888888889 | 0 |
| 0.8395833333333332 | 0 |
| 0.8402777777777778 | 0 |
| 0.8409722222222222 | 0 |
| 0.8416666666666667 | 0 |
| 0.842361111111111 | 0 |
| 0.8430555555555556 | 0 |
| 0.84375 | 0 |
| 0.8444444444444444 | 0 |
| 0.845138888888889 | 0 |
| 0.8458333333333333 | 0 |
| 0.8465277777777778 | 0 |
| 0.8472222222222222 | 0 |
| 0.8479166666666668 | 0 |
| 0.8486111111111111 | 0 |
| 0.8493055555555555 | 0 |
| 0.85 | 0 |
| 0.8506944444444445 | 0 |
| 0.8513888888888889 | 0 |
| 0.8520833333333333 | 0 |
| 0.8527777777777777 | 0 |
| 0.8534722222222223 | 0 |
| 0.8541666666666666 | 0 |
| 0.8548611111111111 | 0 |
| 0.8555555555555556 | 0 |
| 0.8562500000000001 | 0 |
| 0.8569444444444444 | 0 |
| 0.8576388888888888 | 0 |
| 0.8583333333333334 | 0 |
| 0.8590277777777778 | 0 |
| 0.8597222222222222 | 0 |
| 0.8604166666666666 | 0 |
| 0.8611111111111112 | 0 |
| 0.8618055555555556 | 0 |
| 0.8624999999999999 | 0 |
| 0.8631944444444444 | 0 |
| 0.8638888888888889 | 0 |
| 0.8645833333333334 | 0 |
| 0.8652777777777777 | 0 |
| 0.8659722222222223 | 0 |
| 0.8666666666666667 | 0 |
| 0.8673611111111111 | 0 |
| 0.8680555555555555 | 0 |
| 0.86875 | 0 |
| 0.8694444444444445 | 0 |
| 0.8701388888888889 | 0 |
| 0.8708333333333332 | 0 |
| 0.8715277777777778 | 0 |
| 0.8722222222222222 | 0 |
| 0.8729166666666667 | 0 |
| 0.873611111111111 | 0 |
| 0.8743055555555556 | 0 |
| 0.875 | 0 |
| 0.8756944444444444 | 0 |
| 0.876388888888889 | 0 |
| 0.8770833333333333 | 0 |
| 0.8777777777777778 | 0 |
| 0.8784722222222222 | 0 |
| 0.8791666666666668 | 0 |
| 0.8798611111111111 | 0 |
| 0.8805555555555555 | 0 |
| 0.88125 | 0 |
| 0.8819444444444445 | 0 |
| 0.8826388888888889 | 0 |
| 0.8833333333333333 | 0 |
| 0.8840277777777777 | 0 |
| 0.8847222222222223 | 0 |
| 0.8854166666666666 | 0 |
| 0.8861111111111111 | 0 |
| 0.8868055555555556 | 0 |
| 0.8875000000000001 | 0 |
| 0.8881944444444444 | 0 |
| 0.8888888888888888 | 0 |
| 0.8895833333333334 | 0 |
| 0.8902777777777778 | 0 |
| 0.8909722222222222 | 0 |
| 0.8916666666666666 | 0 |
| 0.8923611111111112 | 0 |
| 0.8930555555555556 | 0 |
| 0.8937499999999999 | 0 |
| 0.8944444444444444 | 0 |
| 0.8951388888888889 | 0 |
| 0.8958333333333334 | 0 |
| 0.8965277777777777 | 0 |
| 0.8972222222222223 | 0 |
| 0.8979166666666667 | 0 |
| 0.8986111111111111 | 0 |
| 0.8993055555555555 | 0 |
| 0.9 | 0 |
| 0.9006944444444445 | 0 |
| 0.9013888888888889 | 0 |
| 0.9020833333333332 | 0 |
| 0.9027777777777778 | 0 |
| 0.9034722222222222 | 0 |
| 0.9041666666666667 | 0 |
| 0.904861111111111 | 0 |
| 0.9055555555555556 | 0 |
| 0.90625 | 0 |
| 0.9069444444444444 | 0 |
| 0.907638888888889 | 0 |
| 0.9083333333333333 | 0 |
| 0.9090277777777778 | 0 |
| 0.9097222222222222 | 0 |
| 0.9104166666666668 | 0 |
| 0.9111111111111111 | 0 |
| 0.9118055555555555 | 0 |
| 0.9125 | 0 |
| 0.9131944444444445 | 0 |
| 0.9138888888888889 | 0 |
| 0.9145833333333333 | 0 |
| 0.9152777777777777 | 0 |
| 0.9159722222222223 | 0 |
| 0.9166666666666666 | 0 |
| 0.9173611111111111 | 0 |
| 0.9180555555555556 | 0 |
| 0.9187500000000001 | 0 |
| 0.9194444444444444 | 0 |
| 0.9201388888888888 | 0 |
| 0.9208333333333334 | 0 |
| 0.9215277777777778 | 0 |
| 0.9222222222222222 | 0 |
| 0.9229166666666666 | 0 |
| 0.9236111111111112 | 0 |
| 0.9243055555555556 | 0 |
| 0.9249999999999999 | 0 |
| 0.9256944444444444 | 0 |
| 0.9263888888888889 | 0 |
| 0.9270833333333334 | 0 |
| 0.9277777777777777 | 0 |
| 0.9284722222222223 | 0 |
| 0.9291666666666667 | 0 |
| 0.9298611111111111 | 0 |
| 0.9305555555555555 | 0 |
| 0.93125 | 0 |
| 0.9319444444444445 | 0 |
| 0.9326388888888889 | 0 |
| 0.9333333333333332 | 0 |
| 0.9340277777777778 | 0 |
| 0.9347222222222222 | 0 |
| 0.9354166666666667 | 0 |
| 0.936111111111111 | 0 |
| 0.9368055555555556 | 0 |
| 0.9375 | 0 |
| 0.9381944444444444 | 0 |
| 0.938888888888889 | 0 |
| 0.9395833333333333 | 0 |
| 0.9402777777777778 | 0 |
| 0.9409722222222222 | 0 |
| 0.9416666666666668 | 0 |
| 0.9423611111111111 | 0 |
| 0.9430555555555555 | 0 |
| 0.94375 | 0 |
| 0.9444444444444445 | 0 |
| 0.9451388888888889 | 0 |
| 0.9458333333333333 | 0 |
| 0.9465277777777777 | 0 |
| 0.9472222222222223 | 0 |
| 0.9479166666666666 | 0 |
| 0.9486111111111111 | 0 |
| 0.9493055555555556 | 0 |
| 0.9500000000000001 | 0 |
| 0.9506944444444444 | 0 |
| 0.9513888888888888 | 0 |
| 0.9520833333333334 | 0 |
| 0.9527777777777778 | 0 |
| 0.9534722222222222 | 0 |
| 0.9541666666666666 | 0 |
| 0.9548611111111112 | 0 |
| 0.9555555555555556 | 0 |
| 0.9562499999999999 | 0 |
| 0.9569444444444444 | 0 |
| 0.9576388888888889 | 0 |
| 0.9583333333333334 | 0 |
| 0.9590277777777777 | 0 |
| 0.9597222222222223 | 0 |
| 0.9604166666666667 | 0 |
| 0.9611111111111111 | 0 |
| 0.9618055555555555 | 0 |
| 0.9625 | 0 |
| 0.9631944444444445 | 0 |
| 0.9638888888888889 | 0 |
| 0.9645833333333332 | 0 |
| 0.9652777777777778 | 0 |
| 0.9659722222222222 | 0 |
| 0.9666666666666667 | 0 |
| 0.967361111111111 | 0 |
| 0.9680555555555556 | 0 |
| 0.96875 | 0 |
| 0.9694444444444444 | 0 |
| 0.970138888888889 | 0 |
| 0.9708333333333333 | 0 |
| 0.9715277777777778 | 0 |
| 0.9722222222222222 | 0 |
| 0.9729166666666668 | 0 |
| 0.9736111111111111 | 0 |
| 0.9743055555555555 | 0 |
| 0.975 | 0 |
| 0.9756944444444445 | 0 |
| 0.9763888888888889 | 0 |
| 0.9770833333333333 | 0 |
| 0.9777777777777777 | 0 |
| 0.9784722222222223 | 0 |
| 0.9791666666666666 | 0 |
| 0.9798611111111111 | 0 |
| 0.9805555555555556 | 0 |
| 0.9812500000000001 | 0 |
| 0.9819444444444444 | 0 |
| 0.9826388888888888 | 0 |
| 0.9833333333333334 | 0 |
| 0.9840277777777778 | 0 |
| 0.9847222222222222 | 0 |
| 0.9854166666666666 | 0 |
| 0.9861111111111112 | 0 |
| 0.9868055555555556 | 0 |
| 0.9874999999999999 | 0 |
| 0.9881944444444444 | 0 |
| 0.9888888888888889 | 0 |
| 0.9895833333333334 | 0 |
| 0.9902777777777777 | 0 |
| 0.9909722222222223 | 0 |
| 0.9916666666666667 | 0 |
| 0.9923611111111111 | 0 |
| 0.9930555555555555 | 0 |
| 0.99375 | 0 |
| 0.9944444444444445 | 0 |
| 0.9951388888888889 | 0 |
| 0.9958333333333332 | 0 |
| 0.9965277777777778 | 0 |
| 0.9972222222222222 | 0 |
| 0.9979166666666667 | 0 |
| 0.998611111111111 | 0 |
| 0.9993055555555556 | 0 |